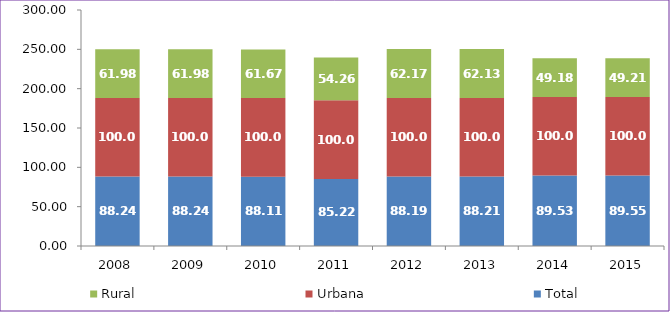
| Category | Total | Urbana | Rural |
|---|---|---|---|
| 2008.0 | 88.24 | 100 | 61.98 |
| 2009.0 | 88.24 | 100 | 61.98 |
| 2010.0 | 88.11 | 100 | 61.67 |
| 2011.0 | 85.22 | 100 | 54.26 |
| 2012.0 | 88.19 | 100 | 62.17 |
| 2013.0 | 88.21 | 100 | 62.13 |
| 2014.0 | 89.53 | 100 | 49.18 |
| 2015.0 | 89.55 | 100 | 49.21 |